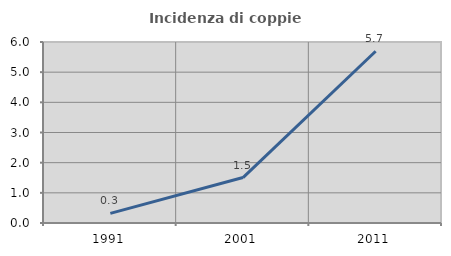
| Category | Incidenza di coppie miste |
|---|---|
| 1991.0 | 0.321 |
| 2001.0 | 1.506 |
| 2011.0 | 5.693 |